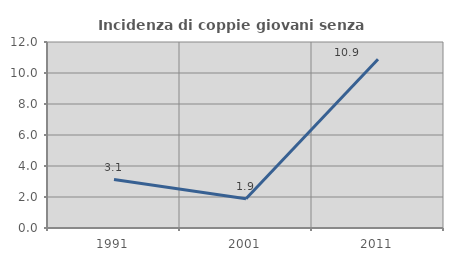
| Category | Incidenza di coppie giovani senza figli |
|---|---|
| 1991.0 | 3.125 |
| 2001.0 | 1.887 |
| 2011.0 | 10.887 |